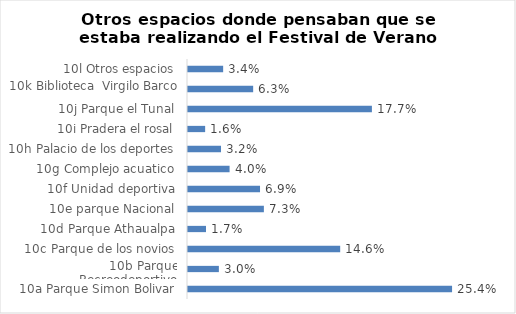
| Category | Series 0 |
|---|---|
| 10a Parque Simon Bolivar | 0.254 |
| 10b Parque Recreodeportivo | 0.03 |
| 10c Parque de los novios | 0.146 |
| 10d Parque Athaualpa | 0.017 |
| 10e parque Nacional | 0.073 |
| 10f Unidad deportiva | 0.069 |
| 10g Complejo acuatico | 0.04 |
| 10h Palacio de los deportes | 0.032 |
| 10i Pradera el rosal | 0.016 |
| 10j Parque el Tunal | 0.177 |
| 10k Biblioteca  Virgilo Barco | 0.063 |
| 10l Otros espacios | 0.034 |